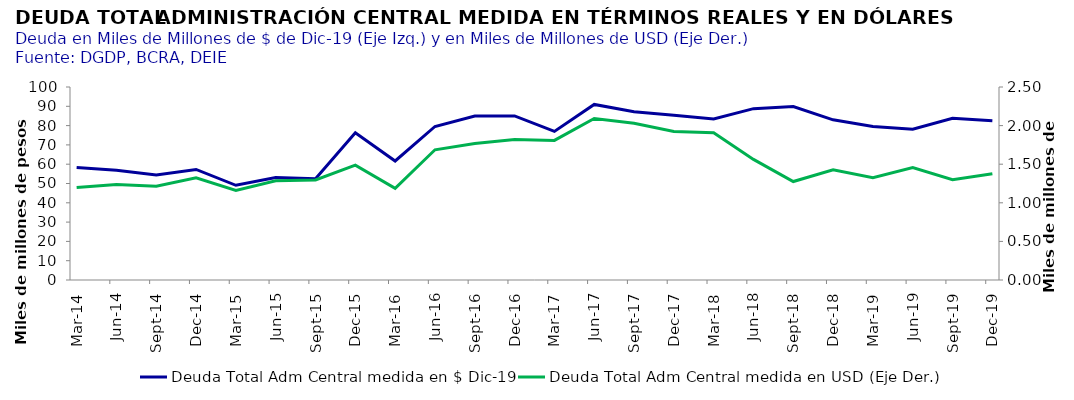
| Category | Deuda Total Adm Central medida en $ Dic-19 |
|---|---|
| 2014-03-31 | 58347196390.397 |
| 2014-06-30 | 56906383042.952 |
| 2014-09-30 | 54454819416.152 |
| 2014-12-31 | 57296654581.666 |
| 2015-03-31 | 49058501029.823 |
| 2015-06-30 | 53071169806.408 |
| 2015-09-30 | 52498794195.87 |
| 2015-12-31 | 76324607530.348 |
| 2016-03-31 | 61669862632.638 |
| 2016-06-30 | 79539779012.449 |
| 2016-09-30 | 84995858782.722 |
| 2016-12-31 | 85017723870.937 |
| 2017-03-31 | 76975060781.722 |
| 2017-06-30 | 90959484726.633 |
| 2017-09-30 | 87219781681.267 |
| 2017-12-31 | 85384890085.718 |
| 2018-03-31 | 83444001658.175 |
| 2018-06-30 | 88784115422.883 |
| 2018-09-30 | 89887195674.019 |
| 2018-12-31 | 83001566494.595 |
| 2019-03-31 | 79564198288.151 |
| 2019-06-30 | 78073478518.527 |
| 2019-09-30 | 83812837621.968 |
| 2019-12-31 | 82512896920.443 |